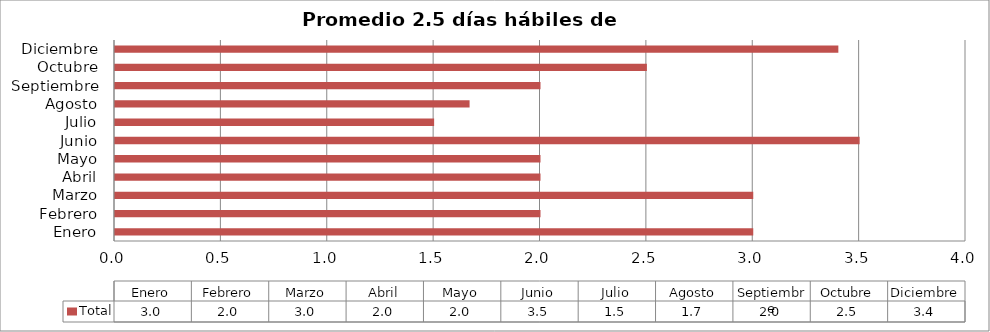
| Category | Total |
|---|---|
| Enero | 3 |
| Febrero | 2 |
| Marzo | 3 |
| Abril | 2 |
| Mayo | 2 |
| Junio | 3.5 |
| Julio | 1.5 |
| Agosto | 1.667 |
| Septiembre | 2 |
| Octubre | 2.5 |
| Diciembre | 3.4 |